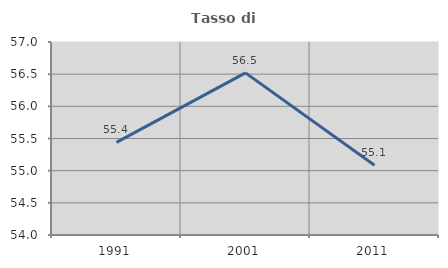
| Category | Tasso di occupazione   |
|---|---|
| 1991.0 | 55.44 |
| 2001.0 | 56.52 |
| 2011.0 | 55.084 |